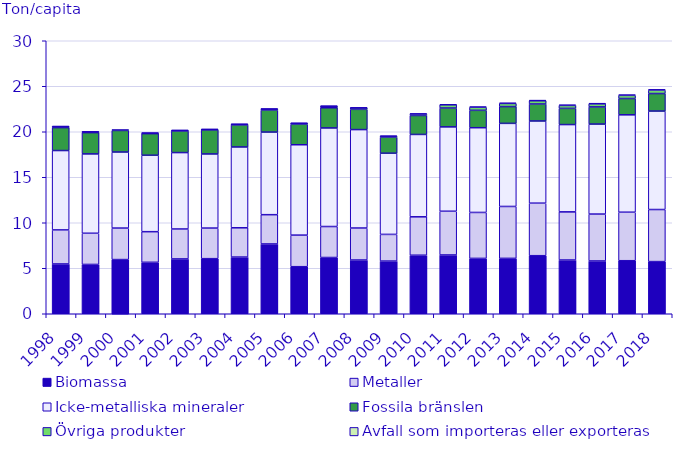
| Category | Biomassa | Metaller | Icke-metalliska mineraler | Fossila bränslen | Övriga produkter | Avfall som importeras eller exporteras |
|---|---|---|---|---|---|---|
| 1998.0 | 5.472 | 3.741 | 8.723 | 2.519 | 0.122 | 0 |
| 1999.0 | 5.418 | 3.428 | 8.719 | 2.34 | 0.088 | 0 |
| 2000.0 | 5.954 | 3.462 | 8.355 | 2.372 | 0.099 | 0 |
| 2001.0 | 5.654 | 3.365 | 8.401 | 2.374 | 0.062 | 0 |
| 2002.0 | 6.023 | 3.291 | 8.398 | 2.382 | 0.059 | 0 |
| 2003.0 | 6.054 | 3.362 | 8.144 | 2.651 | 0.053 | 0 |
| 2004.0 | 6.228 | 3.218 | 8.883 | 2.423 | 0.078 | 0 |
| 2005.0 | 7.669 | 3.218 | 9.077 | 2.418 | 0.122 | 0.002 |
| 2006.0 | 5.171 | 3.471 | 9.93 | 2.256 | 0.11 | 0.001 |
| 2007.0 | 6.18 | 3.406 | 10.832 | 2.219 | 0.177 | 0.001 |
| 2008.0 | 5.903 | 3.517 | 10.817 | 2.227 | 0.166 | 0.003 |
| 2009.0 | 5.787 | 2.934 | 8.921 | 1.764 | 0.11 | 0.017 |
| 2010.0 | 6.431 | 4.221 | 9.051 | 2.085 | 0.167 | 0.031 |
| 2011.0 | 6.458 | 4.806 | 9.27 | 2.071 | 0.357 | 0.049 |
| 2012.0 | 6.083 | 5.049 | 9.31 | 1.912 | 0.341 | 0.056 |
| 2013.0 | 6.087 | 5.704 | 9.13 | 1.845 | 0.346 | 0.058 |
| 2014.0 | 6.379 | 5.773 | 9.03 | 1.866 | 0.36 | 0.068 |
| 2015.0 | 5.904 | 5.292 | 9.593 | 1.781 | 0.324 | 0.068 |
| 2016.0 | 5.8 | 5.153 | 9.889 | 1.887 | 0.338 | 0.071 |
| 2017.0 | 5.829 | 5.328 | 10.703 | 1.793 | 0.347 | 0.075 |
| 2018.0 | 5.731 | 5.723 | 10.819 | 1.926 | 0.385 | 0.072 |